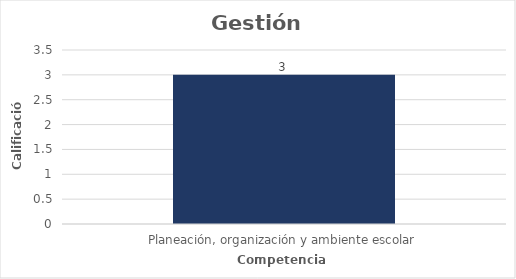
| Category | Series 0 |
|---|---|
| Planeación, organización y ambiente escolar | 3 |